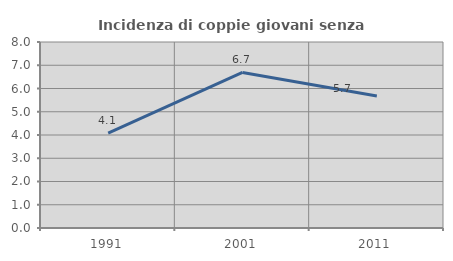
| Category | Incidenza di coppie giovani senza figli |
|---|---|
| 1991.0 | 4.082 |
| 2001.0 | 6.692 |
| 2011.0 | 5.679 |